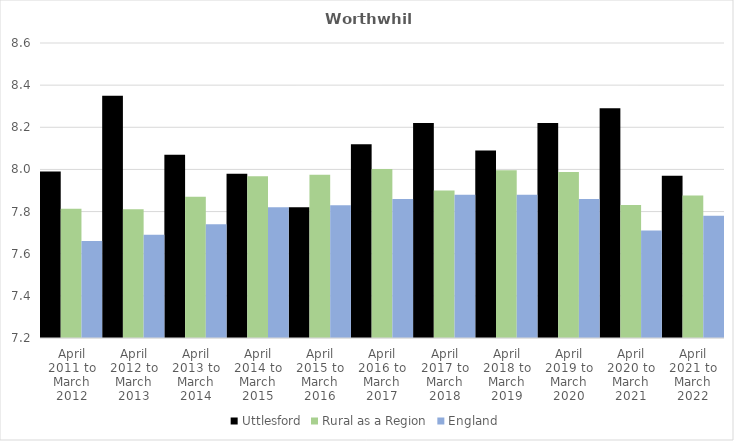
| Category | Uttlesford | Rural as a Region | England |
|---|---|---|---|
| April 2011 to March 2012 | 7.99 | 7.813 | 7.66 |
| April 2012 to March 2013 | 8.35 | 7.811 | 7.69 |
| April 2013 to March 2014 | 8.07 | 7.871 | 7.74 |
| April 2014 to March 2015 | 7.98 | 7.967 | 7.82 |
| April 2015 to March 2016 | 7.82 | 7.975 | 7.83 |
| April 2016 to March 2017 | 8.12 | 8.002 | 7.86 |
| April 2017 to March 2018 | 8.22 | 7.9 | 7.88 |
| April 2018 to March 2019 | 8.09 | 7.996 | 7.88 |
| April 2019 to March 2020 | 8.22 | 7.988 | 7.86 |
| April 2020 to March 2021 | 8.29 | 7.831 | 7.71 |
| April 2021 to March 2022 | 7.97 | 7.877 | 7.78 |